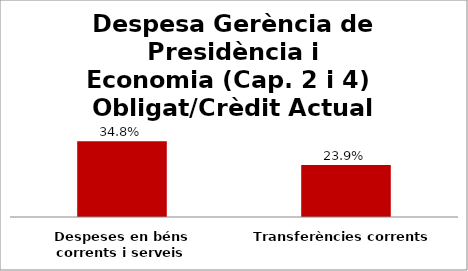
| Category | Series 0 |
|---|---|
| Despeses en béns corrents i serveis | 0.348 |
| Transferències corrents | 0.239 |